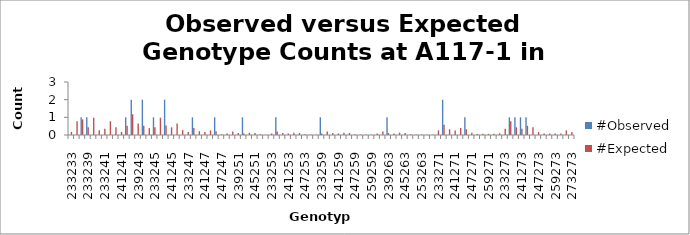
| Category | #Observed | #Expected |
|---|---|---|
| 233233.0 | 0 | 0.174 |
| 233237.0 | 0 | 0.783 |
| 237237.0 | 1 | 0.88 |
| 233239.0 | 1 | 0.435 |
| 237239.0 | 0 | 0.978 |
| 239239.0 | 0 | 0.272 |
| 233241.0 | 0 | 0.348 |
| 237241.0 | 0 | 0.783 |
| 239241.0 | 0 | 0.435 |
| 241241.0 | 0 | 0.174 |
| 233243.0 | 1 | 0.522 |
| 237243.0 | 2 | 1.174 |
| 239243.0 | 0 | 0.652 |
| 241243.0 | 2 | 0.522 |
| 243243.0 | 0 | 0.391 |
| 233245.0 | 1 | 0.435 |
| 237245.0 | 0 | 0.978 |
| 239245.0 | 2 | 0.543 |
| 241245.0 | 0 | 0.435 |
| 243245.0 | 0 | 0.652 |
| 245245.0 | 0 | 0.272 |
| 233247.0 | 0 | 0.174 |
| 237247.0 | 1 | 0.391 |
| 239247.0 | 0 | 0.217 |
| 241247.0 | 0 | 0.174 |
| 243247.0 | 0 | 0.261 |
| 245247.0 | 1 | 0.217 |
| 247247.0 | 0 | 0.043 |
| 233251.0 | 0 | 0.087 |
| 237251.0 | 0 | 0.196 |
| 239251.0 | 0 | 0.109 |
| 241251.0 | 1 | 0.087 |
| 243251.0 | 0 | 0.13 |
| 245251.0 | 0 | 0.109 |
| 247251.0 | 0 | 0.043 |
| 251251.0 | 0 | 0.011 |
| 233253.0 | 0 | 0.087 |
| 237253.0 | 1 | 0.196 |
| 239253.0 | 0 | 0.109 |
| 241253.0 | 0 | 0.087 |
| 243253.0 | 0 | 0.13 |
| 245253.0 | 0 | 0.109 |
| 247253.0 | 0 | 0.043 |
| 251253.0 | 0 | 0.022 |
| 253253.0 | 0 | 0.011 |
| 233259.0 | 1 | 0.087 |
| 237259.0 | 0 | 0.196 |
| 239259.0 | 0 | 0.109 |
| 241259.0 | 0 | 0.087 |
| 243259.0 | 0 | 0.13 |
| 245259.0 | 0 | 0.109 |
| 247259.0 | 0 | 0.043 |
| 251259.0 | 0 | 0.022 |
| 253259.0 | 0 | 0.022 |
| 259259.0 | 0 | 0.011 |
| 233263.0 | 0 | 0.087 |
| 237263.0 | 0 | 0.196 |
| 239263.0 | 1 | 0.109 |
| 241263.0 | 0 | 0.087 |
| 243263.0 | 0 | 0.13 |
| 245263.0 | 0 | 0.109 |
| 247263.0 | 0 | 0.043 |
| 251263.0 | 0 | 0.022 |
| 253263.0 | 0 | 0.022 |
| 259263.0 | 0 | 0.022 |
| 263263.0 | 0 | 0.011 |
| 233271.0 | 0 | 0.261 |
| 237271.0 | 2 | 0.587 |
| 239271.0 | 0 | 0.326 |
| 241271.0 | 0 | 0.261 |
| 243271.0 | 0 | 0.391 |
| 245271.0 | 1 | 0.326 |
| 247271.0 | 0 | 0.13 |
| 251271.0 | 0 | 0.065 |
| 253271.0 | 0 | 0.065 |
| 259271.0 | 0 | 0.065 |
| 263271.0 | 0 | 0.065 |
| 271271.0 | 0 | 0.098 |
| 233273.0 | 0 | 0.348 |
| 237273.0 | 1 | 0.783 |
| 239273.0 | 1 | 0.435 |
| 241273.0 | 1 | 0.348 |
| 243273.0 | 1 | 0.522 |
| 245273.0 | 0 | 0.435 |
| 247273.0 | 0 | 0.174 |
| 251273.0 | 0 | 0.087 |
| 253273.0 | 0 | 0.087 |
| 259273.0 | 0 | 0.087 |
| 263273.0 | 0 | 0.087 |
| 271273.0 | 0 | 0.261 |
| 273273.0 | 0 | 0.174 |